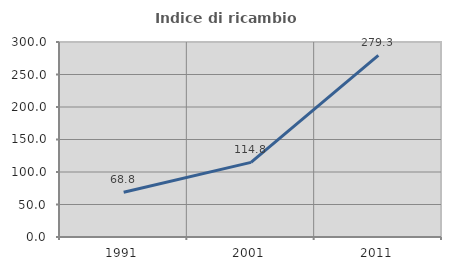
| Category | Indice di ricambio occupazionale  |
|---|---|
| 1991.0 | 68.76 |
| 2001.0 | 114.806 |
| 2011.0 | 279.336 |